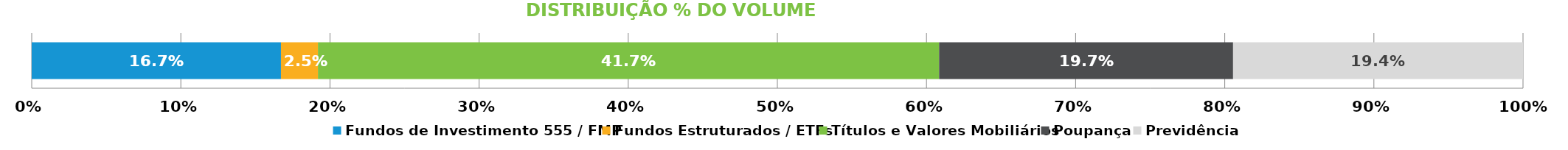
| Category | Fundos de Investimento 555 / FMP | Fundos Estruturados / ETFs | Títulos e Valores Mobiliários | Poupança | Previdência |
|---|---|---|---|---|---|
| 0 | 0.167 | 0.025 | 0.417 | 0.197 | 0.194 |